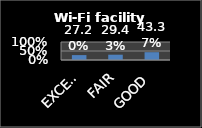
| Category | Series 0 |
|---|---|
| EXCELLENT | 0.272 |
| FAIR | 0.294 |
| GOOD | 0.434 |